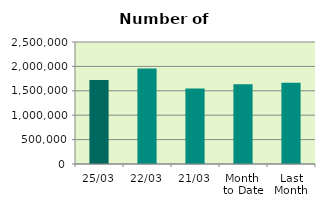
| Category | Series 0 |
|---|---|
| 25/03 | 1721980 |
| 22/03 | 1955656 |
| 21/03 | 1545106 |
| Month 
to Date | 1632344.353 |
| Last
Month | 1666801.1 |